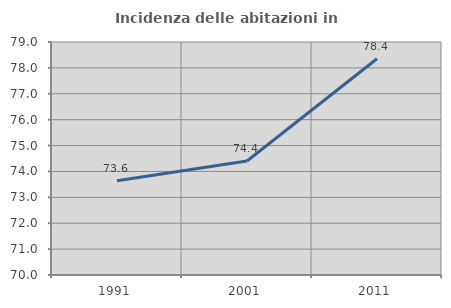
| Category | Incidenza delle abitazioni in proprietà  |
|---|---|
| 1991.0 | 73.637 |
| 2001.0 | 74.405 |
| 2011.0 | 78.354 |